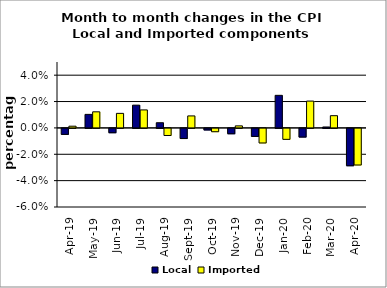
| Category | Local | Imported |
|---|---|---|
| 2019-04-01 | -0.005 | 0.001 |
| 2019-05-01 | 0.01 | 0.012 |
| 2019-06-01 | -0.003 | 0.011 |
| 2019-07-01 | 0.017 | 0.014 |
| 2019-08-01 | 0.004 | -0.005 |
| 2019-09-01 | -0.008 | 0.009 |
| 2019-10-01 | -0.001 | -0.003 |
| 2019-11-01 | -0.004 | 0.002 |
| 2019-12-01 | -0.006 | -0.011 |
| 2020-01-01 | 0.025 | -0.008 |
| 2020-02-01 | -0.007 | 0.02 |
| 2020-03-01 | 0.001 | 0.009 |
| 2020-04-01 | -0.028 | -0.028 |